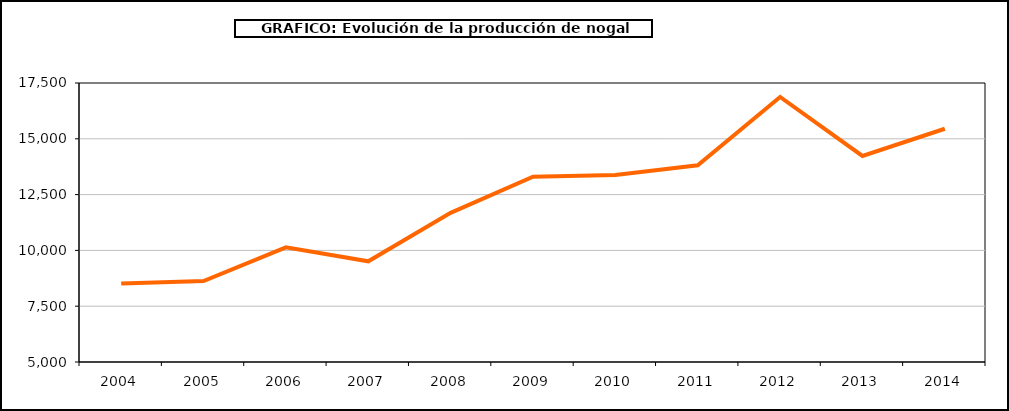
| Category | producción nogal |
|---|---|
| 2004.0 | 8514 |
| 2005.0 | 8629 |
| 2006.0 | 10140 |
| 2007.0 | 9512 |
| 2008.0 | 11682 |
| 2009.0 | 13299 |
| 2010.0 | 13378 |
| 2011.0 | 13815 |
| 2012.0 | 16877 |
| 2013.0 | 14230 |
| 2014.0 | 15450 |